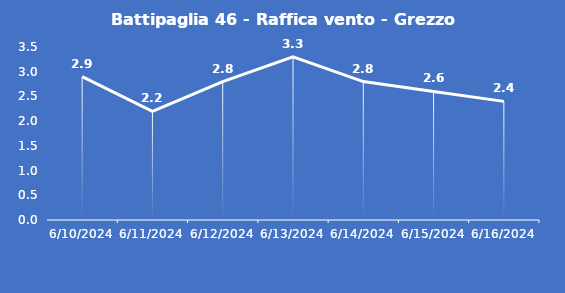
| Category | Battipaglia 46 - Raffica vento - Grezzo (m/s) |
|---|---|
| 6/10/24 | 2.9 |
| 6/11/24 | 2.2 |
| 6/12/24 | 2.8 |
| 6/13/24 | 3.3 |
| 6/14/24 | 2.8 |
| 6/15/24 | 2.6 |
| 6/16/24 | 2.4 |